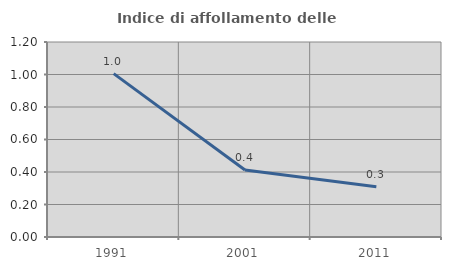
| Category | Indice di affollamento delle abitazioni  |
|---|---|
| 1991.0 | 1.005 |
| 2001.0 | 0.412 |
| 2011.0 | 0.309 |